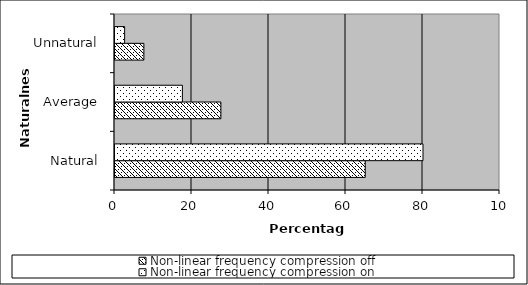
| Category | Non-linear frequency compression off | Non-linear frequency compression on |
|---|---|---|
| Natural | 65 | 80 |
| Average | 27.5 | 17.5 |
| Unnatural | 7.5 | 2.5 |